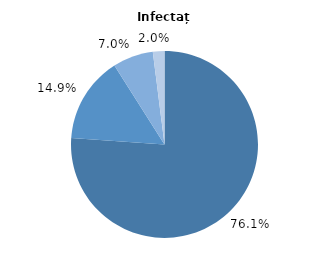
| Category | Infectați |
|---|---|
| Până la 60 ani | 76.1 |
| 60-69 ani | 14.9 |
| 70-79 ani | 7 |
| 80 ani și peste | 2 |